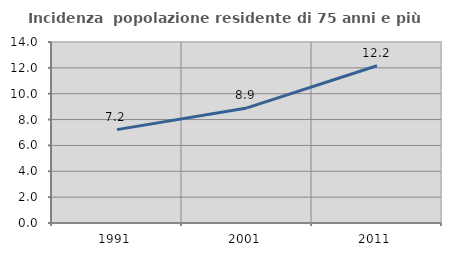
| Category | Incidenza  popolazione residente di 75 anni e più |
|---|---|
| 1991.0 | 7.221 |
| 2001.0 | 8.901 |
| 2011.0 | 12.165 |